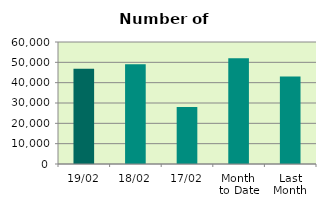
| Category | Series 0 |
|---|---|
| 19/02 | 46860 |
| 18/02 | 49020 |
| 17/02 | 28080 |
| Month 
to Date | 52014 |
| Last
Month | 43047.455 |